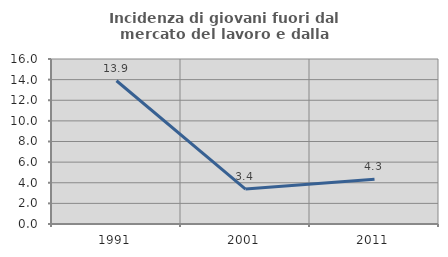
| Category | Incidenza di giovani fuori dal mercato del lavoro e dalla formazione  |
|---|---|
| 1991.0 | 13.889 |
| 2001.0 | 3.39 |
| 2011.0 | 4.348 |